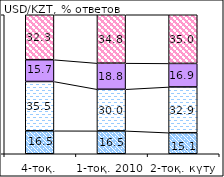
| Category | Көтеріледі | өзгермейді | снизится | білмеймін |
|---|---|---|---|---|
| 4-тоқ. | 16.53 | 35.45 | 15.69 | 32.33 |
| 1-тоқ. 2010  | 16.46 | 29.95 | 18.77 | 34.82 |
| 2-тоқ. күту | 15.13 | 32.94 | 16.91 | 35.01 |